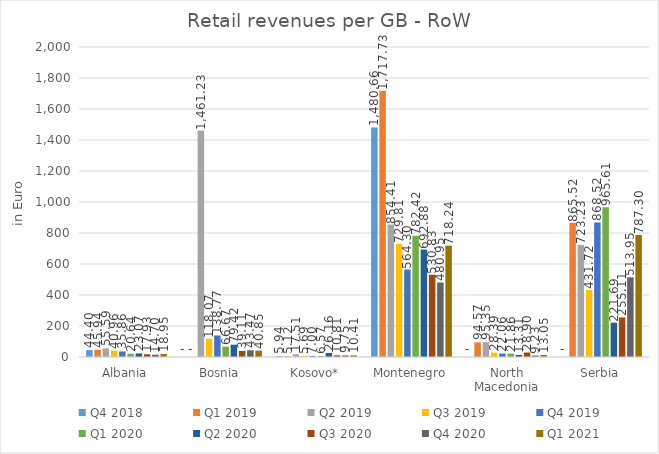
| Category | Q4 2018 | Q1 2019 | Q2 2019 | Q3 2019 | Q4 2019 | Q1 2020 | Q2 2020 | Q3 2020 | Q4 2020 | Q1 2021 |
|---|---|---|---|---|---|---|---|---|---|---|
| Albania | 44.401 | 45.94 | 55.586 | 40.956 | 35.856 | 20.644 | 23.068 | 17.931 | 14.696 | 18.946 |
| Bosnia | 0 | 0 | 1461.226 | 118.074 | 138.765 | 66.671 | 79.42 | 39.109 | 43.466 | 40.85 |
| Kosovo* | 5.944 | 5.12 | 17.512 | 5.691 | 7.002 | 6.567 | 26.159 | 10.805 | 9.755 | 10.413 |
| Montenegro | 1480.656 | 1717.732 | 854.41 | 729.807 | 564.302 | 782.418 | 692.88 | 530.834 | 480.945 | 718.237 |
| North Macedonia | 0 | 94.568 | 95.354 | 28.393 | 22.059 | 21.858 | 13.308 | 28.903 | 9.232 | 13.052 |
| Serbia | 0 | 865.521 | 723.225 | 431.717 | 868.524 | 965.606 | 221.692 | 255.111 | 513.953 | 787.3 |